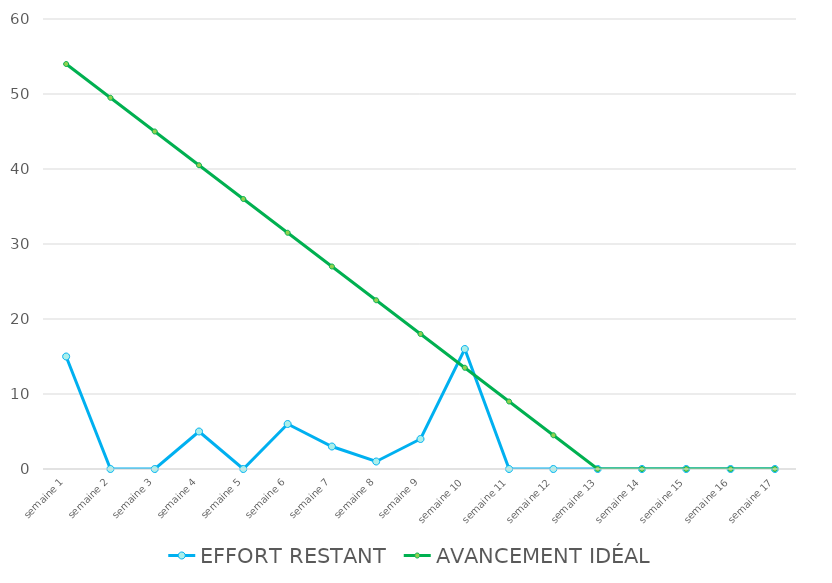
| Category | EFFORT RESTANT | AVANCEMENT IDÉAL |
|---|---|---|
| semaine 1 | 15 | 54 |
| semaine 2 | 0 | 49.5 |
| semaine 3 | 0 | 45 |
| semaine 4 | 5 | 40.5 |
| semaine 5 | 0 | 36 |
| semaine 6 | 6 | 31.5 |
| semaine 7 | 3 | 27 |
| semaine 8 | 1 | 22.5 |
| semaine 9 | 4 | 18 |
| semaine 10 | 16 | 13.5 |
| semaine 11 | 0 | 9 |
| semaine 12 | 0 | 4.5 |
| semaine 13 | 0 | 0 |
| semaine 14 | 0 | 0 |
| semaine 15 | 0 | 0 |
| semaine 16 | 0 | 0 |
| semaine 17 | 0 | 0 |